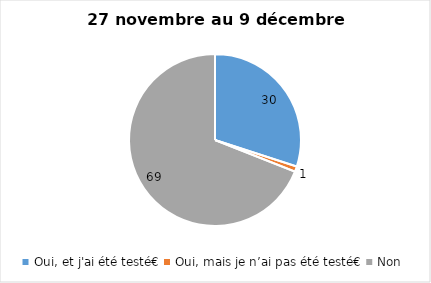
| Category | Series 0 |
|---|---|
| Oui, et j'ai été testé€ | 30 |
| Oui, mais je n’ai pas été testé€ | 1 |
| Non | 69 |